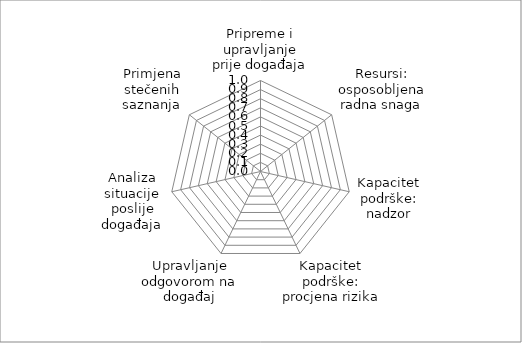
| Category | Series 0 |
|---|---|
| Pripreme i upravljanje prije događaja | 0 |
| Resursi: osposobljena radna snaga | 0 |
| Kapacitet podrške: nadzor | 0 |
| Kapacitet podrške: procjena rizika | 0 |
| Upravljanje odgovorom na događaj | 0 |
| Analiza situacije poslije događaja | 0 |
| Primjena stečenih saznanja | 0 |